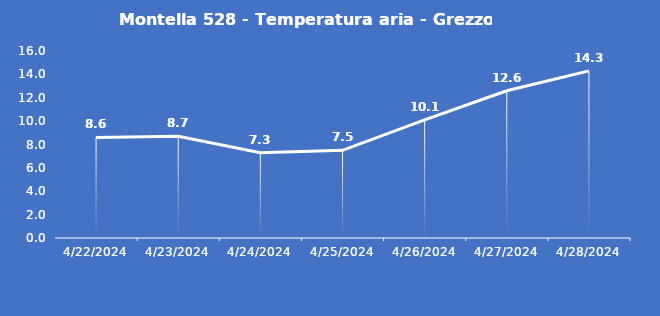
| Category | Montella 528 - Temperatura aria - Grezzo (°C) |
|---|---|
| 4/22/24 | 8.6 |
| 4/23/24 | 8.7 |
| 4/24/24 | 7.3 |
| 4/25/24 | 7.5 |
| 4/26/24 | 10.1 |
| 4/27/24 | 12.6 |
| 4/28/24 | 14.3 |